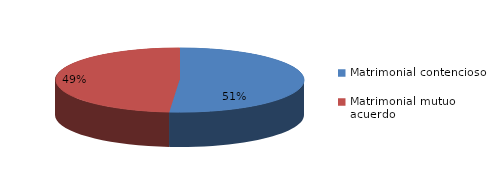
| Category | Series 0 |
|---|---|
| 0 | 59 |
| 1 | 56 |